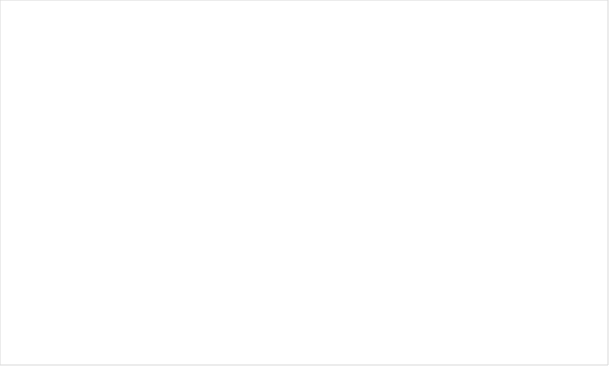
| Category | Ingen brist | Föreläggande | Anmärkning |
|---|---|---|---|
| Enskild en enhet | 0.802 | 0.182 | 0.017 |
| Enskild flera enhet | 0.855 | 0.068 | 0.077 |